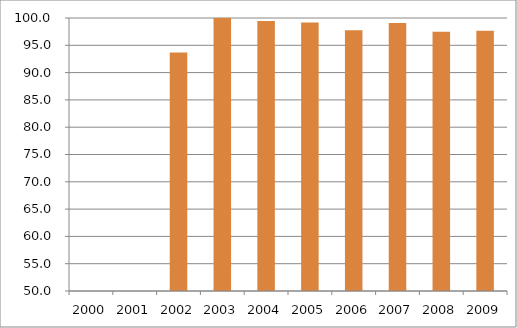
| Category | Região Sul |
|---|---|
| 2000.0 | 0 |
| 2001.0 | 0 |
| 2002.0 | 93.67 |
| 2003.0 | 110.32 |
| 2004.0 | 99.43 |
| 2005.0 | 99.18 |
| 2006.0 | 97.75 |
| 2007.0 | 99.07 |
| 2008.0 | 97.5 |
| 2009.0 | 97.68 |